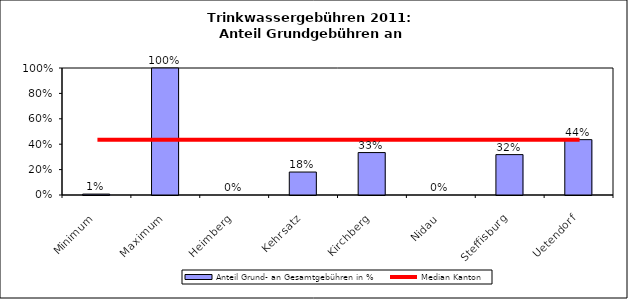
| Category | Anteil Grund- an Gesamtgebühren in % |
|---|---|
| Minimum | 0.007 |
| Maximum | 1 |
| Heimberg | 0 |
| Kehrsatz | 0.181 |
| Kirchberg | 0.334 |
| Nidau | 0 |
| Steffisburg | 0.318 |
| Uetendorf | 0.436 |